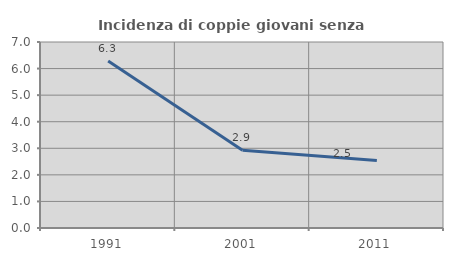
| Category | Incidenza di coppie giovani senza figli |
|---|---|
| 1991.0 | 6.287 |
| 2001.0 | 2.926 |
| 2011.0 | 2.545 |